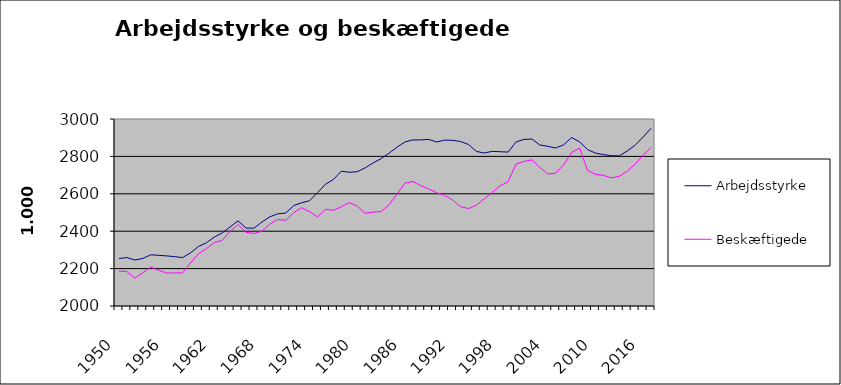
| Category | Arbejdsstyrke | Beskæftigede |
|---|---|---|
| 1950.0 | 2254 | 2187 |
| 1951.0 | 2259 | 2184 |
| 1952.0 | 2246 | 2149 |
| 1953.0 | 2254 | 2178 |
| 1954.0 | 2274 | 2208 |
| 1955.0 | 2271 | 2191 |
| 1956.0 | 2268 | 2176 |
| 1957.0 | 2264 | 2177 |
| 1958.0 | 2259 | 2177 |
| 1959.0 | 2284 | 2230 |
| 1960.0 | 2318 | 2279 |
| 1961.0 | 2338 | 2306 |
| 1962.0 | 2368 | 2339 |
| 1963.0 | 2391 | 2351 |
| 1964.0 | 2423 | 2400 |
| 1965.0 | 2455 | 2435 |
| 1966.0 | 2417 | 2394 |
| 1967.0 | 2416 | 2388 |
| 1968.0 | 2449 | 2400 |
| 1969.0 | 2477 | 2438 |
| 1970.0 | 2493 | 2463 |
| 1971.0 | 2497 | 2458 |
| 1972.0 | 2537 | 2499 |
| 1973.0 | 2552 | 2526 |
| 1974.0 | 2563 | 2505 |
| 1975.0 | 2606 | 2476 |
| 1976.0 | 2651 | 2517 |
| 1977.0 | 2676 | 2512 |
| 1978.0 | 2721 | 2530 |
| 1979.0 | 2715 | 2553 |
| 1980.0 | 2718 | 2534 |
| 1981.0 | 2739 | 2496 |
| 1982.0 | 2765 | 2502 |
| 1983.0 | 2788 | 2505 |
| 1984.0 | 2817 | 2541 |
| 1985.0 | 2849 | 2597 |
| 1986.0 | 2877 | 2657 |
| 1987.0 | 2888 | 2666 |
| 1988.0 | 2888 | 2644 |
| 1989.0 | 2891 | 2626 |
| 1990.0 | 2877 | 2606 |
| 1991.0 | 2887 | 2591 |
| 1992.0 | 2886 | 2568 |
| 1993.0 | 2880 | 2531 |
| 1994.0 | 2864 | 2521 |
| 1995.0 | 2827 | 2539 |
| 1996.0 | 2818 | 2573 |
| 1997.0 | 2827 | 2607 |
| 1998.0 | 2825 | 2643 |
| 1999.0 | 2823 | 2665 |
| 2000.0 | 2877 | 2759 |
| 2001.0 | 2891 | 2773 |
| 2002.0 | 2893 | 2782 |
| 2003.0 | 2861 | 2741 |
| 2004.0 | 2854 | 2706 |
| 2005.0 | 2845 | 2710 |
| 2006.0 | 2862 | 2755 |
| 2007.0 | 2901 | 2821 |
| 2008.0 | 2878.13 | 2844.814 |
| 2009.0 | 2836.606 | 2725.724 |
| 2010.0 | 2817.675 | 2704.542 |
| 2011.0 | 2809.748 | 2698.418 |
| 2012.0 | 2803.672 | 2684.84 |
| 2013.0 | 2802.733 | 2693.948 |
| 2014.0 | 2829 | 2720 |
| 2015.0 | 2860 | 2759 |
| 2016.0 | 2903 | 2805 |
| 2017.0 | 2951 | 2848 |